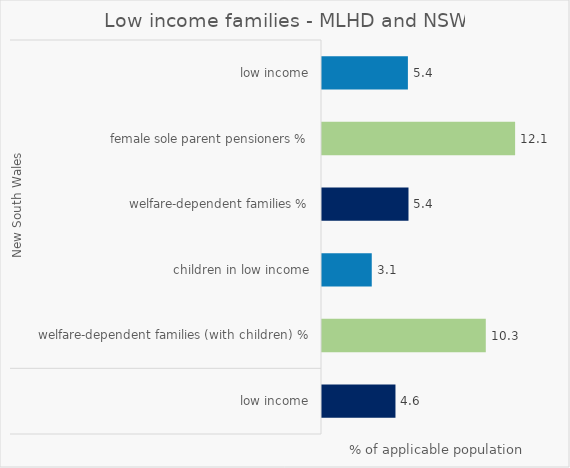
| Category | Total |
|---|---|
| 0 | 4.611 |
| 1 | 10.279 |
| 2 | 3.123 |
| 3 | 5.428 |
| 4 | 12.12 |
| 5 | 5.391 |